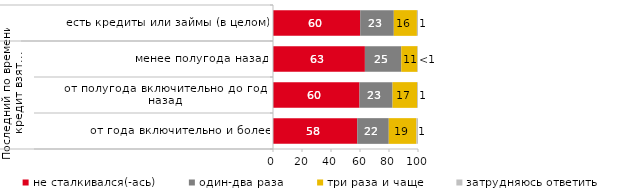
| Category | не сталкивался(-ась) | один-два раза | три раза и чаще | затрудняюсь ответить |
|---|---|---|---|---|
| 0 | 60.149 | 23.163 | 15.94 | 0.747 |
| 1 | 63.374 | 25.103 | 11.111 | 0.412 |
| 2 | 59.649 | 22.807 | 16.959 | 0.585 |
| 3 | 58.09 | 21.751 | 19.098 | 1.061 |